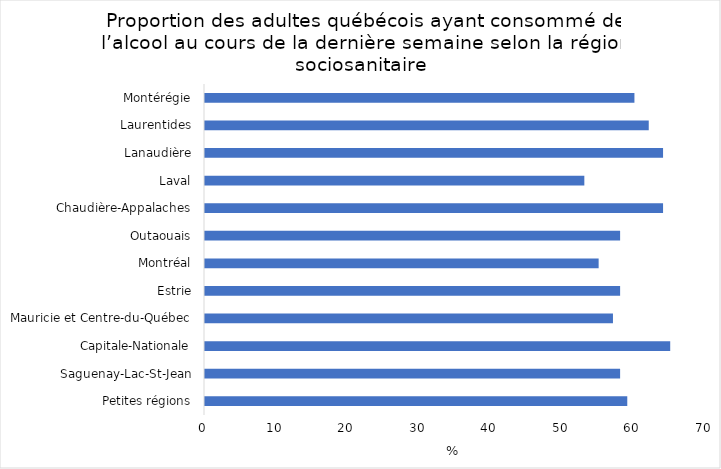
| Category | Series 0 |
|---|---|
| Petites régions | 59 |
| Saguenay-Lac-St-Jean | 58 |
| Capitale-Nationale | 65 |
| Mauricie et Centre-du-Québec | 57 |
| Estrie | 58 |
| Montréal | 55 |
| Outaouais | 58 |
| Chaudière-Appalaches | 64 |
| Laval | 53 |
| Lanaudière | 64 |
| Laurentides | 62 |
| Montérégie | 60 |